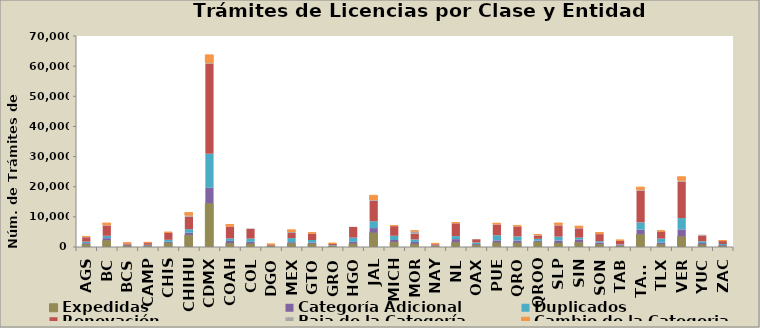
| Category | Expedidas | Categoría Adicional | Duplicados | Renovación | Baja de la Categoría | Cambio de la Categoria |
|---|---|---|---|---|---|---|
| AGS | 950 | 317 | 518 | 1443 | 85 | 183 |
| BC | 2237 | 701 | 782 | 3408 | 136 | 684 |
| BCS | 482 | 182 | 121 | 442 | 30 | 13 |
| CAMP | 417 | 148 | 166 | 574 | 69 | 126 |
| CHIS | 1373 | 342 | 669 | 2317 | 55 | 111 |
| CHIHU | 3965 | 756 | 1182 | 4149 | 459 | 907 |
| CDMX | 14501 | 5128 | 11273 | 29816 | 293 | 2721 |
| COAH | 1304 | 710 | 818 | 3974 | 48 | 618 |
| COL | 1107 | 620 | 1063 | 3176 | 172 | 0 |
| DGO | 281 | 54 | 126 | 377 | 4 | 66 |
| MEX | 1233 | 359 | 1356 | 1711 | 335 | 695 |
| GTO | 1097 | 386 | 845 | 2144 | 67 | 226 |
| GRO | 270 | 103 | 209 | 527 | 16 | 16 |
| HGO | 1116 | 601 | 1398 | 3557 | 0 | 0 |
| JAL | 4725 | 1556 | 2288 | 6737 | 273 | 1549 |
| MICH | 1626 | 696 | 1400 | 3210 | 12 | 118 |
| MOR | 1009 | 659 | 860 | 1847 | 834 | 172 |
| NAY | 293 | 73 | 132 | 425 | 104 | 92 |
| NL | 1568 | 1046 | 1003 | 4246 | 53 | 167 |
| OAX | 773 | 223 | 494 | 1088 | 75 | 0 |
| PUE | 1444 | 765 | 1684 | 3569 | 103 | 312 |
| QRO | 1383 | 785 | 1340 | 3315 | 38 | 201 |
| QROO | 1732 | 347 | 642 | 1047 | 199 | 98 |
| SLP | 1329 | 837 | 1265 | 3740 | 181 | 607 |
| SIN | 1591 | 884 | 645 | 3072 | 121 | 607 |
| SON | 981 | 510 | 446 | 2336 | 50 | 474 |
| TAB | 403 | 173 | 256 | 1259 | 42 | 118 |
| TAMS | 4230 | 1497 | 2433 | 10553 | 282 | 869 |
| TLX | 898 | 547 | 1336 | 2425 | 1 | 131 |
| VER | 3518 | 2327 | 3749 | 12102 | 317 | 1282 |
| YUC | 834 | 483 | 569 | 1908 | 284 | 0 |
| ZAC | 416 | 221 | 366 | 966 | 25 | 148 |